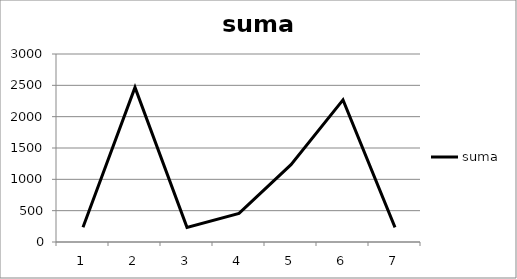
| Category | suma |
|---|---|
| 0 | 234 |
| 1 | 2467 |
| 2 | 234 |
| 3 | 456 |
| 4 | 1235 |
| 5 | 2267 |
| 6 | 234 |